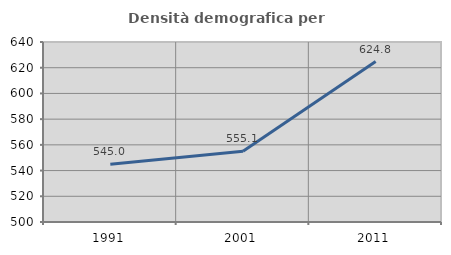
| Category | Densità demografica |
|---|---|
| 1991.0 | 544.952 |
| 2001.0 | 555.103 |
| 2011.0 | 624.789 |